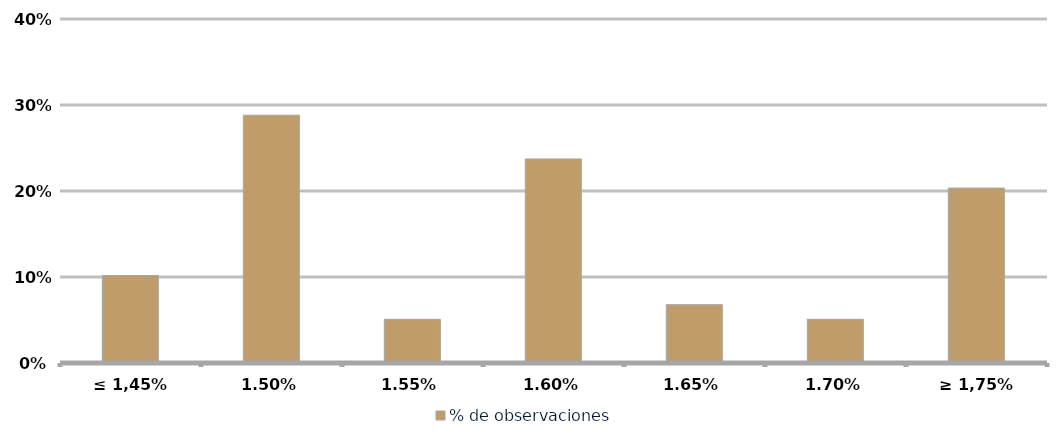
| Category | % de observaciones  |
|---|---|
| ≤ 1,45% | 0.102 |
| 1,50% | 0.288 |
| 1,55% | 0.051 |
| 1,60% | 0.237 |
| 1,65% | 0.068 |
| 1,70% | 0.051 |
| ≥ 1,75% | 0.203 |